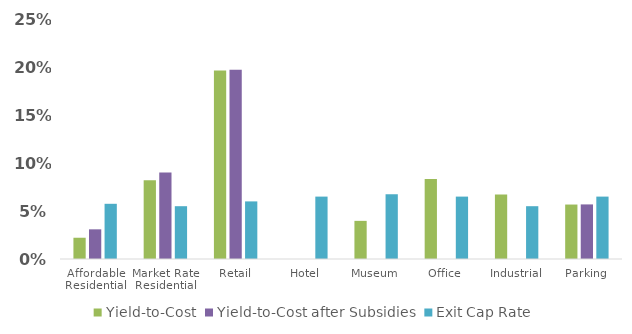
| Category | Yield-to-Cost | Yield-to-Cost after Subsidies | Exit Cap Rate |
|---|---|---|---|
| Affordable Residential | 0.022 | 0.031 | 0.058 |
| Market Rate Residential | 0.082 | 0.09 | 0.055 |
| Retail | 0.196 | 0.197 | 0.06 |
| Hotel | 0 | 0 | 0.065 |
| Museum | 0.04 | 0 | 0.068 |
| Office | 0.083 | 0 | 0.065 |
| Industrial | 0.067 | 0 | 0.055 |
| Parking | 0.057 | 0.057 | 0.065 |